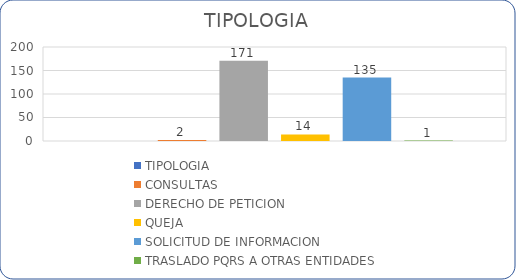
| Category | TIPOLOGIA  | CONSULTAS | DERECHO DE PETICION | QUEJA | SOLICITUD DE INFORMACION | TRASLADO PQRS A OTRAS ENTIDADES |
|---|---|---|---|---|---|---|
| 0 |  | 2 | 171 | 14 | 135 | 1 |